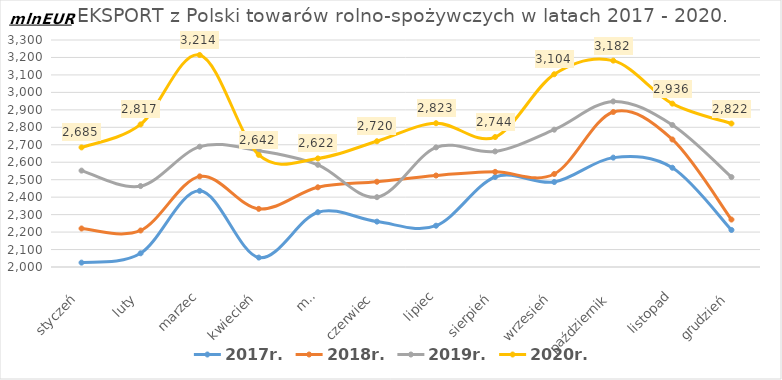
| Category | 2017r. | 2018r. | 2019r. | 2020r. |
|---|---|---|---|---|
| styczeń | 2025.027 | 2220.567 | 2552.041 | 2684.881 |
| luty | 2078.48 | 2209.087 | 2463.491 | 2816.651 |
| marzec | 2436.169 | 2518.868 | 2689.048 | 3214.124 |
| kwiecień | 2054.081 | 2332.89 | 2666.157 | 2642.009 |
| maj | 2313.708 | 2456.41 | 2585.354 | 2621.695 |
| czerwiec | 2259.912 | 2488.29 | 2399.927 | 2720.089 |
| lipiec | 2236.498 | 2523.967 | 2684.871 | 2823.379 |
| sierpień | 2515.473 | 2544.819 | 2661.93 | 2744.182 |
| wrzesień | 2486.698 | 2532.602 | 2786.361 | 3103.827 |
| październik | 2626.393 | 2887.888 | 2948.145 | 3181.86 |
| listopad | 2568.408 | 2730.271 | 2813.189 | 2935.595 |
| grudzień | 2212.072 | 2271.721 | 2515 | 2821.61 |